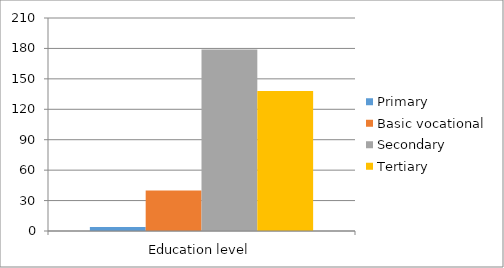
| Category | Primary | Basic vocational | Secondary | Tertiary |
|---|---|---|---|---|
| Education level | 4 | 40 | 179 | 138 |